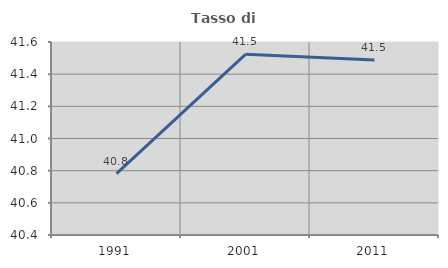
| Category | Tasso di occupazione   |
|---|---|
| 1991.0 | 40.782 |
| 2001.0 | 41.523 |
| 2011.0 | 41.488 |